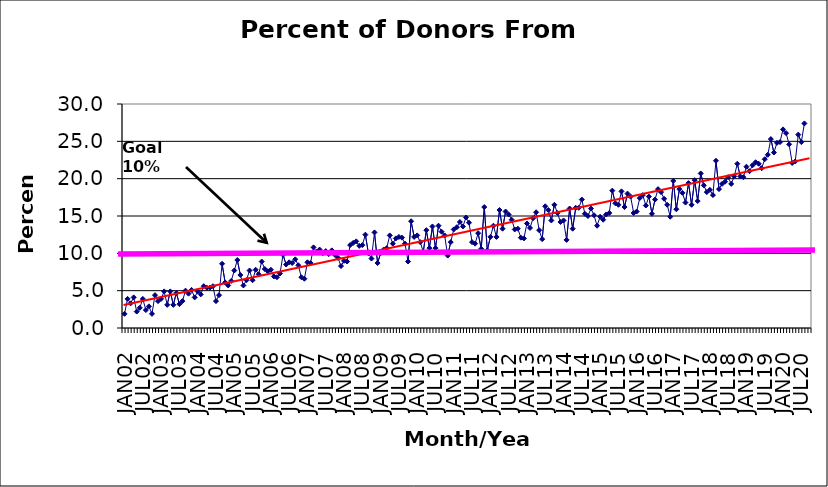
| Category | Series 0 |
|---|---|
| JAN02 | 1.9 |
| FEB02 | 3.9 |
| MAR02 | 3.3 |
| APR02 | 4.1 |
| MAY02 | 2.2 |
| JUN02 | 2.7 |
| JUL02 | 3.9 |
| AUG02 | 2.4 |
| SEP02 | 2.9 |
| OCT02 | 1.9 |
| NOV02 | 4.4 |
| DEC02 | 3.6 |
| JAN03 | 3.9 |
| FEB03 | 4.9 |
| MAR03 | 3.1 |
| APR03 | 4.9 |
| MAY03 | 3.1 |
| JUN03 | 4.7 |
| JUL03 | 3.2 |
| AUG03 | 3.6 |
| SEP03 | 5 |
| OCT03 | 4.6 |
| NOV03 | 5.1 |
| DEC03 | 4.1 |
| JAN04 | 4.9 |
| FEB04 | 4.5 |
| MAR04 | 5.6 |
| APR04 | 5.4 |
| MAY04 | 5.4 |
| JUN04 | 5.6 |
| JUL04 | 3.6 |
| AUG04 | 4.4 |
| SEP04 | 8.6 |
| OCT04 | 6.1 |
| NOV04 | 5.7 |
| DEC04 | 6.3 |
| JAN05 | 7.7 |
| FEB05 | 9.1 |
| MAR05 | 7.1 |
| APR05 | 5.7 |
| MAY05 | 6.4 |
| JUN05 | 7.7 |
| JUL05 | 6.4 |
| AUG05 | 7.8 |
| SEP05 | 7.2 |
| OCT05 | 8.9 |
| NOV05 | 7.9 |
| DEC05 | 7.6 |
| JAN06 | 7.8 |
| FEB06 | 6.9 |
| MAR06 | 6.8 |
| APR06 | 7.3 |
| MAY06 | 9.8 |
| JUN06 | 8.5 |
| JUL06 | 8.8 |
| AUG06 | 8.7 |
| SEP06 | 9.2 |
| OCT06 | 8.4 |
| NOV06 | 6.8 |
| DEC06 | 6.6 |
| JAN07 | 8.8 |
| FEB07 | 8.7 |
| MAR07 | 10.8 |
| APR07 | 10.2 |
| MAY07 | 10.5 |
| JUN07 | 10 |
| JUL07 | 10.3 |
| AUG07 | 9.9 |
| SEP07 | 10.4 |
| OCT07 | 9.8 |
| NOV07 | 9.4 |
| DEC07 | 8.3 |
| JAN08 | 9 |
| FEB08 | 8.9 |
| MAR08 | 11.1 |
| APR08 | 11.4 |
| MAY08 | 11.6 |
| JUN08 | 11 |
| JUL08 | 11.1 |
| AUG08 | 12.5 |
| SEP08 | 10 |
| OCT08 | 9.3 |
| NOV08 | 12.8 |
| DEC08 | 8.7 |
| JAN09 | 10 |
| FEB09 | 10.5 |
| MAR09 | 10.7 |
| APR09 | 12.4 |
| MAY09 | 11.3 |
| JUN09 | 12 |
| JUL09 | 12.2 |
| AUG09 | 12.1 |
| SEP09 | 11.3 |
| OCT09 | 8.9 |
| NOV09 | 14.3 |
| DEC09 | 12.2 |
| JAN10 | 12.4 |
| FEB10 | 11.5 |
| MAR10 | 10.2 |
| APR10 | 13.1 |
| MAY10 | 10.7 |
| JUN10 | 13.6 |
| JUL10 | 10.7 |
| AUG10 | 13.7 |
| SEP10 | 12.9 |
| OCT10 | 12.4 |
| NOV10 | 9.7 |
| DEC10 | 11.5 |
| JAN11 | 13.2 |
| FEB11 | 13.5 |
| MAR11 | 14.2 |
| APR11 | 13.6 |
| MAY11 | 14.8 |
| JUN11 | 14.1 |
| JUL11 | 11.5 |
| AUG11 | 11.3 |
| SEP11 | 12.7 |
| OCT11 | 10.6 |
| NOV11 | 16.2 |
| DEC11 | 10.4 |
| JAN12 | 12.2 |
| FEB12 | 13.7 |
| MAR12 | 12.2 |
| APR12 | 15.8 |
| MAY12 | 13.3 |
| JUN12 | 15.6 |
| JUL12 | 15.2 |
| AUG12 | 14.5 |
| SEP12 | 13.2 |
| OCT12 | 13.3 |
| NOV12 | 12.1 |
| DEC12 | 12 |
| JAN13 | 14 |
| FEB13 | 13.4 |
| MAR13 | 14.7 |
| APR13 | 15.5 |
| MAY13 | 13.1 |
| JUN13 | 11.9 |
| JUL13 | 16.3 |
| AUG13 | 15.8 |
| SEP13 | 14.4 |
| OCT13 | 16.5 |
| NOV13 | 15.4 |
| DEC13 | 14.2 |
| JAN14 | 14.4 |
| FEB14 | 11.8 |
| MAR14 | 16 |
| APR14 | 13.3 |
| MAY14 | 16.1 |
| JUN14 | 16.1 |
| JUL14 | 17.2 |
| AUG14 | 15.3 |
| SEP14 | 15 |
| OCT14 | 16 |
| NOV14 | 15.1 |
| DEC14 | 13.7 |
| JAN15 | 14.9 |
| FEB15 | 14.5 |
| MAR15 | 15.2 |
| APR15 | 15.4 |
| MAY15 | 18.4 |
| JUN15 | 16.7 |
| JUL15 | 16.5 |
| AUG15 | 18.3 |
| SEP15 | 16.2 |
| OCT15 | 18 |
| NOV15 | 17.6 |
| DEC15 | 15.4 |
| JAN16 | 15.6 |
| FEB16 | 17.4 |
| MAR16 | 17.8 |
| APR16 | 16.4 |
| MAY16 | 17.6 |
| JUN16 | 15.3 |
| JUL16 | 17.2 |
| AUG16 | 18.6 |
| SEP16 | 18.2 |
| OCT16 | 17.3 |
| NOV16 | 16.5 |
| DEC16 | 14.9 |
| JAN17 | 19.7 |
| FEB17 | 15.9 |
| MAR17 | 18.6 |
| APR17 | 18.1 |
| MAY17 | 16.8 |
| JUN17 | 19.4 |
| JUL17 | 16.5 |
| AUG17 | 19.8 |
| SEP17 | 17 |
| OCT17 | 20.7 |
| NOV17 | 19.1 |
| DEC17 | 18.2 |
| JAN18 | 18.5 |
| FEB18 | 17.8 |
| MAR18 | 22.4 |
| APR18 | 18.6 |
| MAY18 | 19.3 |
| JUN18 | 19.6 |
| JUL18 | 20.2 |
| AUG18 | 19.3 |
| SEP18 | 20.3 |
| OCT18 | 22 |
| NOV18 | 20.3 |
| DEC18 | 20.2 |
| JAN19 | 21.6 |
| FEB19 | 21 |
| MAR19 | 21.8 |
| APR19 | 22.2 |
| MAY19 | 22 |
| JUN19 | 21.4 |
| JUL19 | 22.6 |
| AUG19 | 23.2 |
| SEP19 | 25.3 |
| OCT19 | 23.5 |
| NOV19 | 24.8 |
| DEC19 | 24.9 |
| JAN20 | 26.6 |
| FEB20 | 26.1 |
| MAR20 | 24.6 |
| APR20 | 22.1 |
| MAY20 | 22.3 |
| JUN20 | 25.9 |
| JUL20 | 24.9 |
| AUG20 | 27.4 |